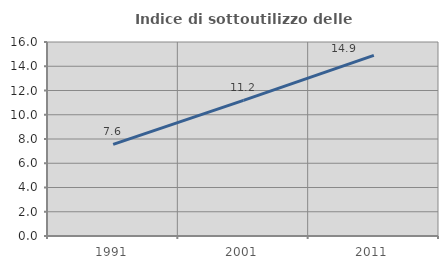
| Category | Indice di sottoutilizzo delle abitazioni  |
|---|---|
| 1991.0 | 7.552 |
| 2001.0 | 11.191 |
| 2011.0 | 14.902 |